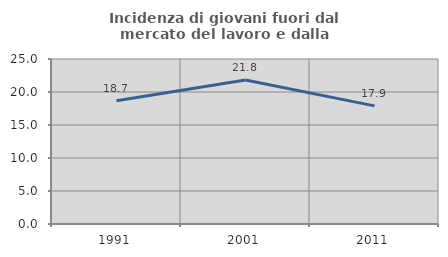
| Category | Incidenza di giovani fuori dal mercato del lavoro e dalla formazione  |
|---|---|
| 1991.0 | 18.673 |
| 2001.0 | 21.813 |
| 2011.0 | 17.901 |